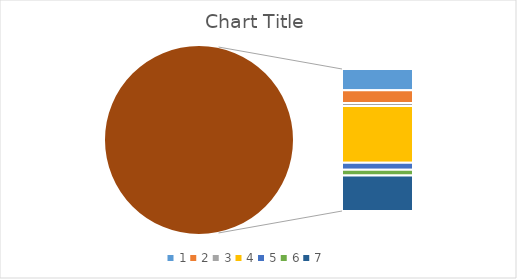
| Category | Series 0 |
|---|---|
| 0 | 15 |
| 1 | 9 |
| 2 | 2 |
| 3 | 40 |
| 4 | 5 |
| 5 | 4 |
| 6 | 25 |